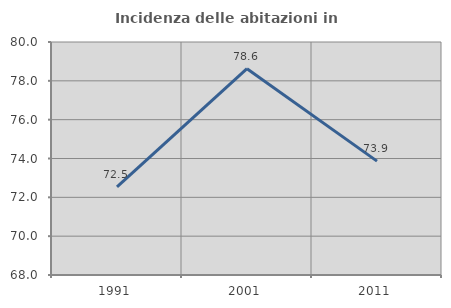
| Category | Incidenza delle abitazioni in proprietà  |
|---|---|
| 1991.0 | 72.538 |
| 2001.0 | 78.627 |
| 2011.0 | 73.866 |